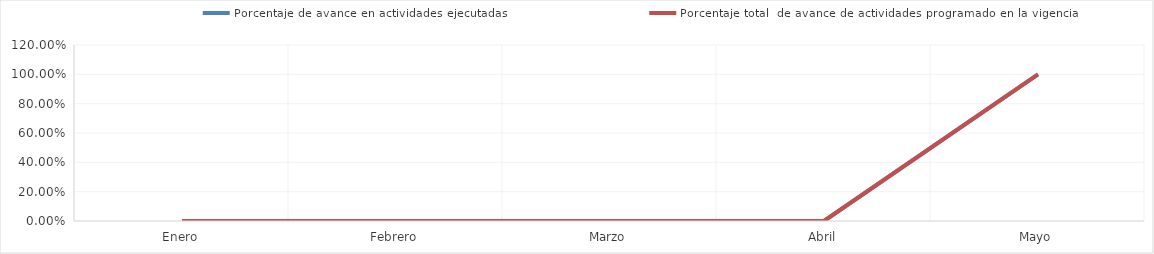
| Category | Porcentaje de avance en actividades ejecutadas | Porcentaje total  de avance de actividades programado en la vigencia |
|---|---|---|
| 0 | 0 | 0 |
| 1 | 0 | 0 |
| 2 | 0 | 0 |
| 3 | 0 | 0 |
| 4 | 1 | 1 |